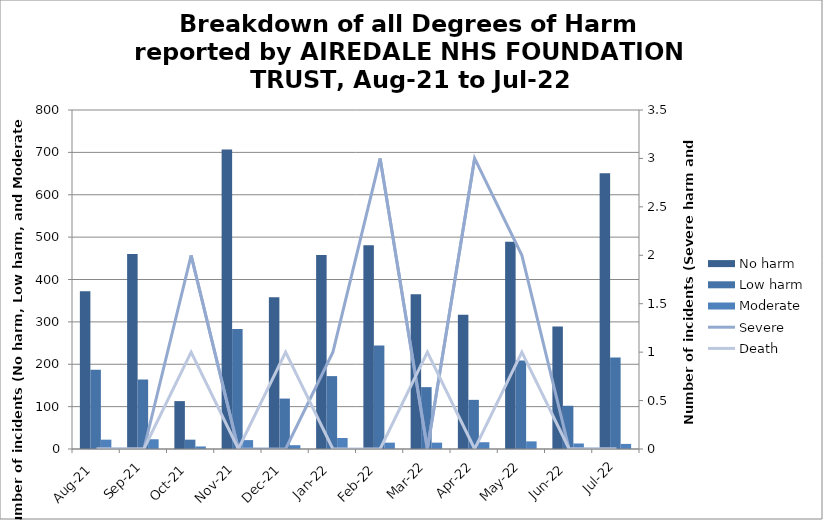
| Category | No harm | Low harm | Moderate |
|---|---|---|---|
| Aug-21 | 372 | 187 | 22 |
| Sep-21 | 460 | 164 | 23 |
| Oct-21 | 113 | 22 | 6 |
| Nov-21 | 707 | 283 | 21 |
| Dec-21 | 358 | 119 | 9 |
| Jan-22 | 458 | 172 | 26 |
| Feb-22 | 481 | 244 | 15 |
| Mar-22 | 365 | 146 | 15 |
| Apr-22 | 317 | 116 | 16 |
| May-22 | 489 | 209 | 18 |
| Jun-22 | 289 | 102 | 13 |
| Jul-22 | 651 | 216 | 12 |